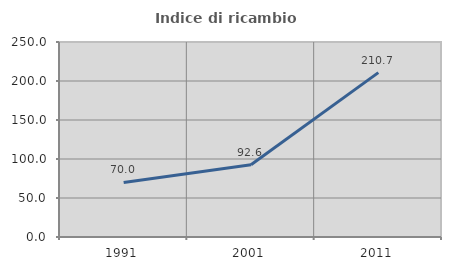
| Category | Indice di ricambio occupazionale  |
|---|---|
| 1991.0 | 70 |
| 2001.0 | 92.647 |
| 2011.0 | 210.714 |